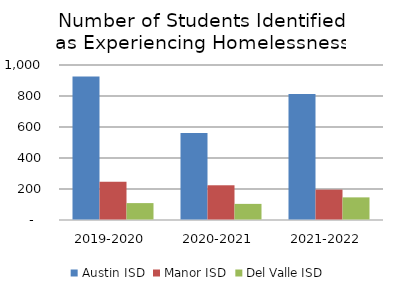
| Category | Austin ISD | Manor ISD | Del Valle ISD |
|---|---|---|---|
| 2019-2020 | 926 | 246 | 109 |
| 2020-2021 | 562 | 224 | 104 |
| 2021-2022 | 813 | 196 | 146 |